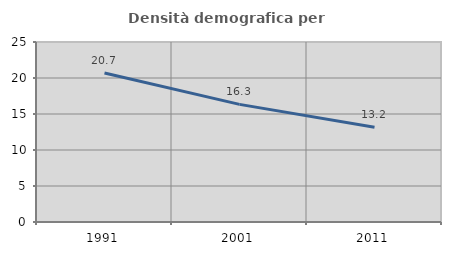
| Category | Densità demografica |
|---|---|
| 1991.0 | 20.695 |
| 2001.0 | 16.334 |
| 2011.0 | 13.165 |